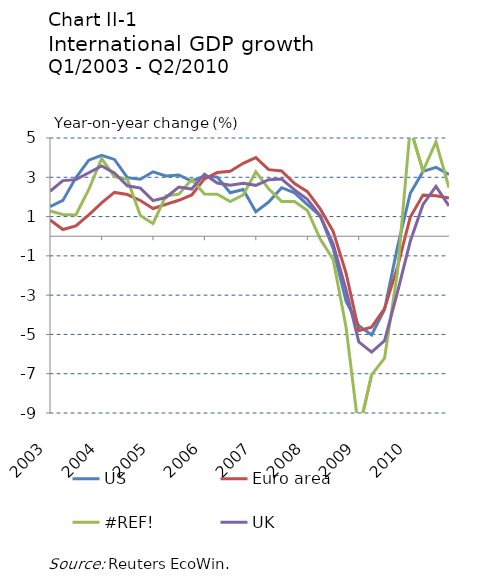
| Category | US | Euro area | #REF! | UK |
|---|---|---|---|---|
| 2003-03-31 | 1.5 | 0.83 | 1.29 | 2.29 |
| 2003-06-30 | 1.82 | 0.34 | 1.11 | 2.83 |
| 2003-09-30 | 2.97 | 0.52 | 1.08 | 2.88 |
| 2003-12-31 | 3.87 | 1.09 | 2.38 | 3.23 |
| 2004-03-31 | 4.12 | 1.7 | 3.95 | 3.58 |
| 2004-06-30 | 3.91 | 2.23 | 3.03 | 3.22 |
| 2004-09-30 | 2.98 | 2.12 | 2.9 | 2.57 |
| 2004-12-31 | 2.9 | 1.82 | 1.05 | 2.45 |
| 2005-03-31 | 3.28 | 1.41 | 0.64 | 1.81 |
| 2005-06-30 | 3.07 | 1.62 | 2.05 | 1.97 |
| 2005-09-30 | 3.12 | 1.83 | 2.14 | 2.5 |
| 2005-12-31 | 2.81 | 2.1 | 2.89 | 2.4 |
| 2006-03-31 | 3.05 | 2.92 | 2.15 | 3.16 |
| 2006-06-30 | 3.01 | 3.24 | 2.14 | 2.71 |
| 2006-09-30 | 2.21 | 3.31 | 1.76 | 2.59 |
| 2006-12-31 | 2.38 | 3.71 | 2.1 | 2.7 |
| 2007-03-31 | 1.24 | 4 | 3.28 | 2.59 |
| 2007-06-30 | 1.74 | 3.39 | 2.41 | 2.88 |
| 2007-09-30 | 2.47 | 3.32 | 1.77 | 2.91 |
| 2007-12-31 | 2.21 | 2.68 | 1.77 | 2.36 |
| 2008-03-31 | 1.61 | 2.27 | 1.31 | 1.88 |
| 2008-06-30 | 1.04 | 1.39 | -0.14 | 1.04 |
| 2008-09-30 | -0.62 | 0.25 | -1.18 | -0.4 |
| 2008-12-31 | -3.32 | -1.89 | -4.65 | -2.75 |
| 2009-03-31 | -4.55 | -4.81 | -9.91 | -5.38 |
| 2009-06-30 | -5.03 | -4.63 | -7.06 | -5.9 |
| 2009-09-30 | -3.73 | -3.69 | -6.21 | -5.32 |
| 2009-12-31 | -0.54 | -1.56 | -1.81 | -2.84 |
| 2010-03-31 | 2.17 | 0.96 | 5.52 | -0.27 |
| 2010-06-30 | 3.3 | 2.1 | 3.32 | 1.62 |
| 2010-09-30 | 3.51 | 2.06 | 4.8 | 2.54 |
| 2010-12-31 | 3.14 | 1.94 | 2.48 | 1.54 |